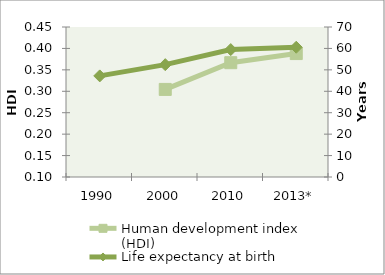
| Category | Human development index (HDI) |
|---|---|
| 1990 | 0 |
| 2000 | 0.304 |
| 2010 | 0.367 |
| 2013* | 0.388 |